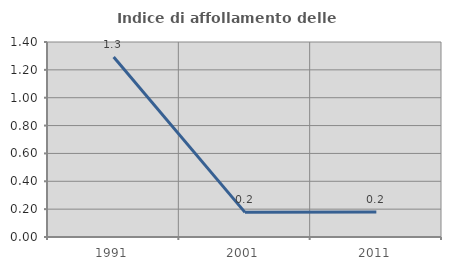
| Category | Indice di affollamento delle abitazioni  |
|---|---|
| 1991.0 | 1.292 |
| 2001.0 | 0.177 |
| 2011.0 | 0.179 |